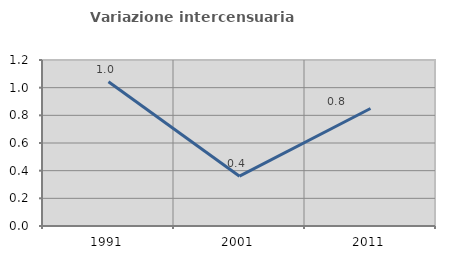
| Category | Variazione intercensuaria annua |
|---|---|
| 1991.0 | 1.043 |
| 2001.0 | 0.36 |
| 2011.0 | 0.849 |